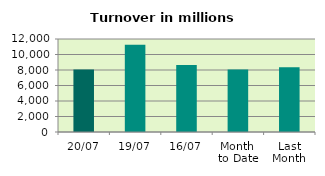
| Category | Series 0 |
|---|---|
| 20/07 | 8064.291 |
| 19/07 | 11258.491 |
| 16/07 | 8633.114 |
| Month 
to Date | 8059.679 |
| Last
Month | 8344.334 |